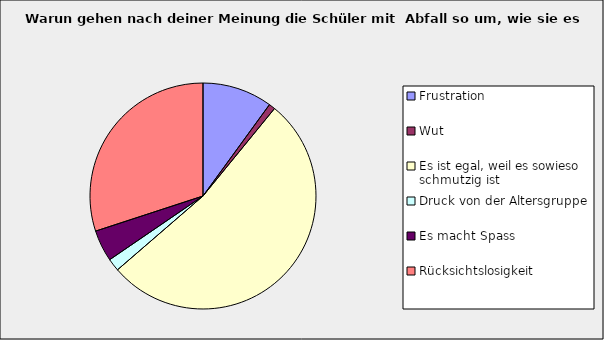
| Category | Series 0 |
|---|---|
| Frustration | 0.1 |
| Wut | 0.009 |
| Es ist egal, weil es sowieso schmutzig ist | 0.527 |
| Druck von der Altersgruppe | 0.018 |
| Es macht Spass | 0.045 |
| Rücksichtslosigkeit | 0.3 |